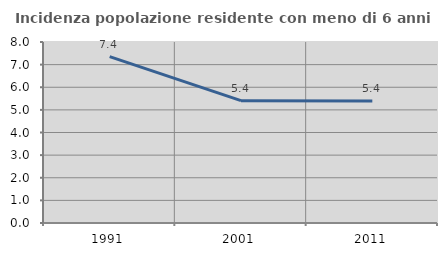
| Category | Incidenza popolazione residente con meno di 6 anni |
|---|---|
| 1991.0 | 7.356 |
| 2001.0 | 5.408 |
| 2011.0 | 5.396 |